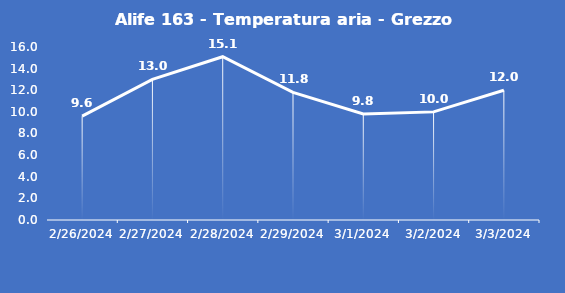
| Category | Alife 163 - Temperatura aria - Grezzo (°C) |
|---|---|
| 2/26/24 | 9.6 |
| 2/27/24 | 13 |
| 2/28/24 | 15.1 |
| 2/29/24 | 11.8 |
| 3/1/24 | 9.8 |
| 3/2/24 | 10 |
| 3/3/24 | 12 |